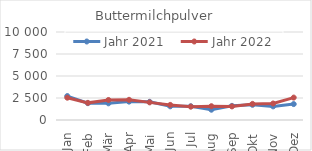
| Category | Jahr 2021 | Jahr 2022 |
|---|---|---|
| Jan | 2721.544 | 2535.806 |
| Feb | 1912.84 | 1948.632 |
| Mär | 1895.238 | 2275.201 |
| Apr | 2088.101 | 2293.596 |
| Mai | 2067.374 | 2002.087 |
| Jun | 1556.931 | 1716.76 |
| Jul | 1564.598 | 1517.628 |
| Aug | 1167.861 | 1566.254 |
| Sep | 1606.156 | 1546.275 |
| Okt | 1724.912 | 1830.785 |
| Nov | 1548.844 | 1874.856 |
| Dez | 1808.865 | 2547.661 |